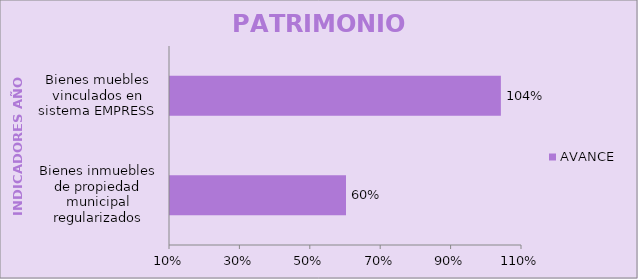
| Category | AVANCE  |
|---|---|
| Bienes inmuebles de propiedad municipal regularizados | 0.6 |
| Bienes muebles vinculados en sistema EMPRESS | 1.04 |